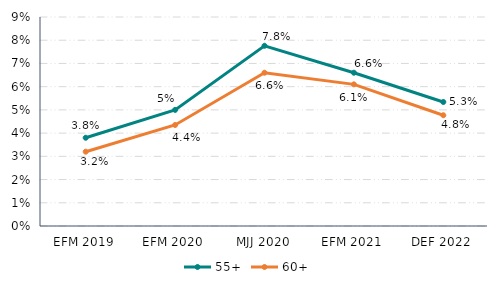
| Category | 55+ | 60+ |
|---|---|---|
| EFM 2019 | 0.038 | 0.032 |
| EFM 2020 | 0.05 | 0.044 |
| MJJ 2020 | 0.078 | 0.066 |
| EFM 2021 | 0.066 | 0.061 |
| DEF 2022 | 0.053 | 0.048 |